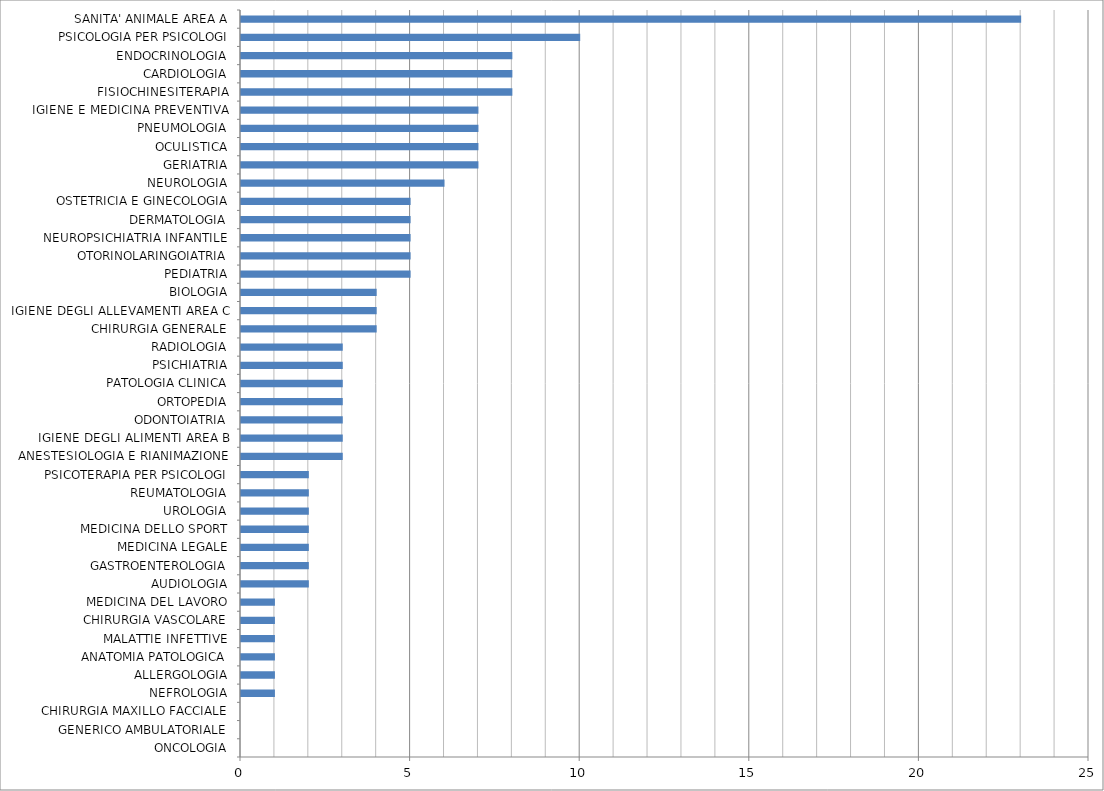
| Category | Series 0 |
|---|---|
| ONCOLOGIA | 0 |
| GENERICO AMBULATORIALE | 0 |
| CHIRURGIA MAXILLO FACCIALE | 0 |
| NEFROLOGIA | 1 |
| ALLERGOLOGIA | 1 |
| ANATOMIA PATOLOGICA | 1 |
| MALATTIE INFETTIVE | 1 |
| CHIRURGIA VASCOLARE | 1 |
| MEDICINA DEL LAVORO | 1 |
| AUDIOLOGIA | 2 |
| GASTROENTEROLOGIA | 2 |
| MEDICINA LEGALE | 2 |
| MEDICINA DELLO SPORT | 2 |
| UROLOGIA | 2 |
| REUMATOLOGIA | 2 |
| PSICOTERAPIA PER PSICOLOGI | 2 |
| ANESTESIOLOGIA E RIANIMAZIONE | 3 |
| IGIENE DEGLI ALIMENTI AREA B | 3 |
| ODONTOIATRIA | 3 |
| ORTOPEDIA | 3 |
| PATOLOGIA CLINICA | 3 |
| PSICHIATRIA | 3 |
| RADIOLOGIA | 3 |
| CHIRURGIA GENERALE | 4 |
| IGIENE DEGLI ALLEVAMENTI AREA C | 4 |
| BIOLOGIA | 4 |
| PEDIATRIA | 5 |
| OTORINOLARINGOIATRIA | 5 |
| NEUROPSICHIATRIA INFANTILE | 5 |
| DERMATOLOGIA | 5 |
| OSTETRICIA E GINECOLOGIA | 5 |
| NEUROLOGIA | 6 |
| GERIATRIA | 7 |
| OCULISTICA | 7 |
| PNEUMOLOGIA | 7 |
| IGIENE E MEDICINA PREVENTIVA | 7 |
| FISIOCHINESITERAPIA | 8 |
| CARDIOLOGIA | 8 |
| ENDOCRINOLOGIA | 8 |
| PSICOLOGIA PER PSICOLOGI | 10 |
| SANITA' ANIMALE AREA A | 23 |